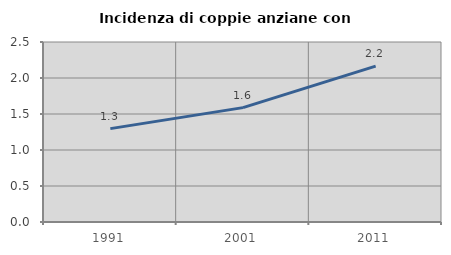
| Category | Incidenza di coppie anziane con figli |
|---|---|
| 1991.0 | 1.297 |
| 2001.0 | 1.589 |
| 2011.0 | 2.166 |